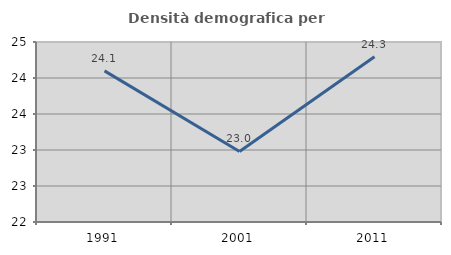
| Category | Densità demografica |
|---|---|
| 1991.0 | 24.099 |
| 2001.0 | 22.979 |
| 2011.0 | 24.296 |